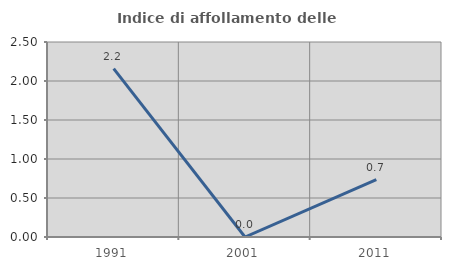
| Category | Indice di affollamento delle abitazioni  |
|---|---|
| 1991.0 | 2.158 |
| 2001.0 | 0 |
| 2011.0 | 0.735 |